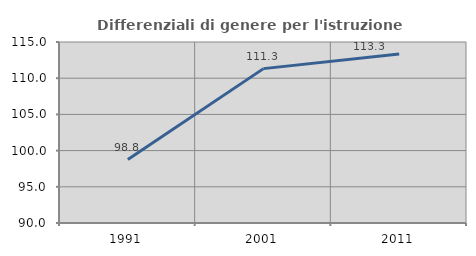
| Category | Differenziali di genere per l'istruzione superiore |
|---|---|
| 1991.0 | 98.766 |
| 2001.0 | 111.322 |
| 2011.0 | 113.347 |